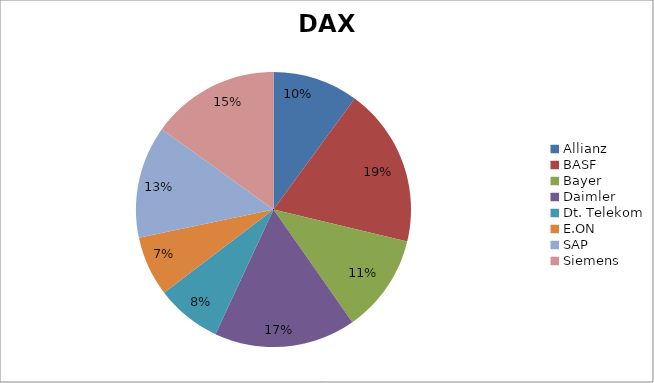
| Category | Series 0 |
|---|---|
| Allianz | 14940.24 |
| BASF | 27760.5 |
| Bayer | 17143 |
| Daimler | 24756.24 |
| Dt. Telekom | 11441.18 |
| E.ON | 10481.3 |
| SAP | 19621.5 |
| Siemens | 22433.4 |